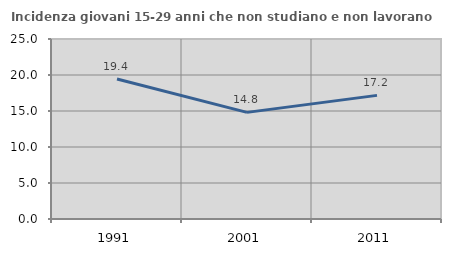
| Category | Incidenza giovani 15-29 anni che non studiano e non lavorano  |
|---|---|
| 1991.0 | 19.444 |
| 2001.0 | 14.809 |
| 2011.0 | 17.17 |